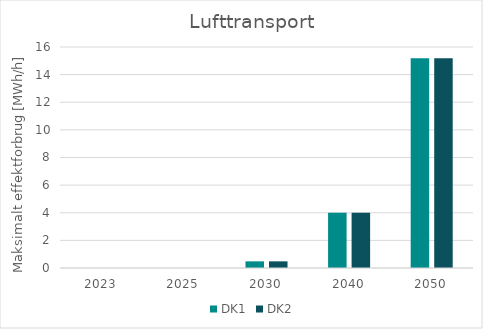
| Category | DK1 | DK2 |
|---|---|---|
| 2023.0 | 0 | 0 |
| 2025.0 | 0 | 0 |
| 2030.0 | 0.482 | 0.482 |
| 2040.0 | 4.002 | 4.002 |
| 2050.0 | 15.177 | 15.177 |